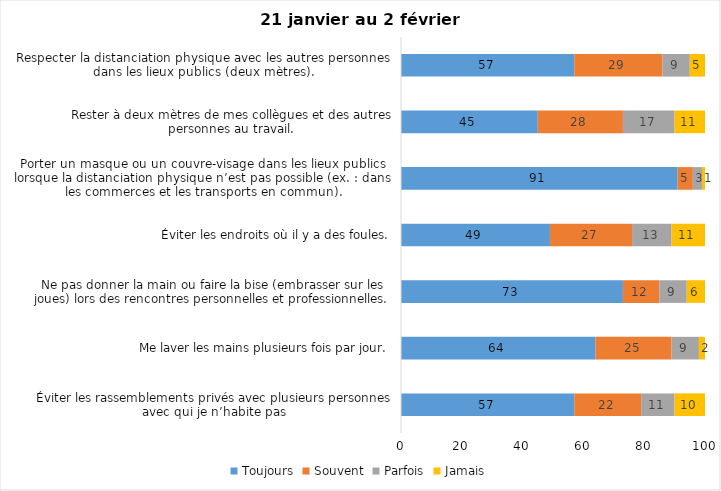
| Category | Toujours | Souvent | Parfois | Jamais |
|---|---|---|---|---|
| Éviter les rassemblements privés avec plusieurs personnes avec qui je n’habite pas | 57 | 22 | 11 | 10 |
| Me laver les mains plusieurs fois par jour. | 64 | 25 | 9 | 2 |
| Ne pas donner la main ou faire la bise (embrasser sur les joues) lors des rencontres personnelles et professionnelles. | 73 | 12 | 9 | 6 |
| Éviter les endroits où il y a des foules. | 49 | 27 | 13 | 11 |
| Porter un masque ou un couvre-visage dans les lieux publics lorsque la distanciation physique n’est pas possible (ex. : dans les commerces et les transports en commun). | 91 | 5 | 3 | 1 |
| Rester à deux mètres de mes collègues et des autres personnes au travail. | 45 | 28 | 17 | 11 |
| Respecter la distanciation physique avec les autres personnes dans les lieux publics (deux mètres). | 57 | 29 | 9 | 5 |